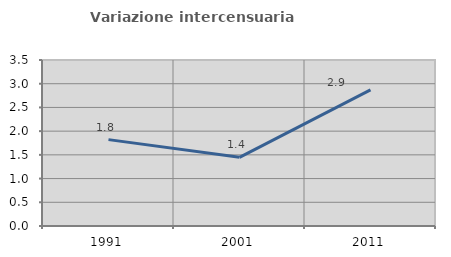
| Category | Variazione intercensuaria annua |
|---|---|
| 1991.0 | 1.821 |
| 2001.0 | 1.448 |
| 2011.0 | 2.869 |